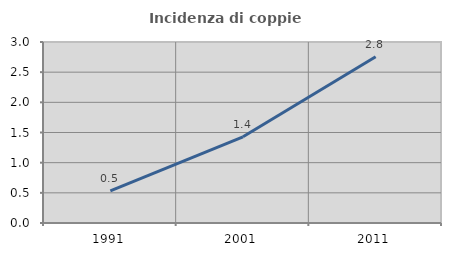
| Category | Incidenza di coppie miste |
|---|---|
| 1991.0 | 0.534 |
| 2001.0 | 1.429 |
| 2011.0 | 2.756 |